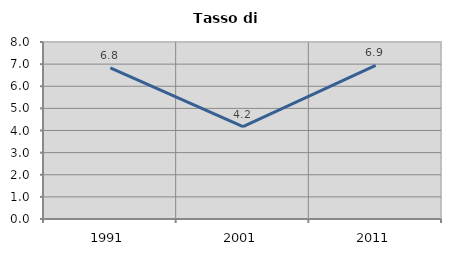
| Category | Tasso di disoccupazione   |
|---|---|
| 1991.0 | 6.832 |
| 2001.0 | 4.174 |
| 2011.0 | 6.947 |